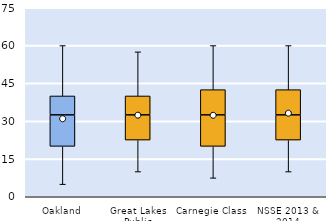
| Category | 25th | 50th | 75th |
|---|---|---|---|
| Oakland | 20 | 12.5 | 7.5 |
| Great Lakes Public | 22.5 | 10 | 7.5 |
| Carnegie Class | 20 | 12.5 | 10 |
| NSSE 2013 & 2014 | 22.5 | 10 | 10 |